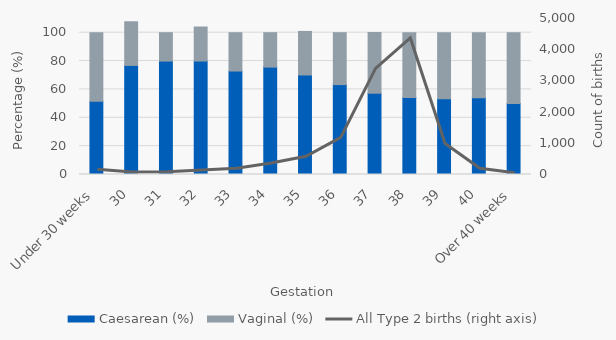
| Category | Caesarean (%) | Vaginal (%) |
|---|---|---|
| Under 30 weeks | 51.613 | 48.387 |
| 30 | 76.923 | 30.769 |
| 31 | 80 | 20 |
| 32 | 80 | 24 |
| 33 | 72.973 | 27.027 |
| 34 | 75.714 | 24.286 |
| 35 | 70.175 | 30.702 |
| 36 | 63.404 | 36.596 |
| 37 | 57.312 | 42.836 |
| 38 | 54.358 | 45.528 |
| 39 | 53.333 | 46.667 |
| 40 | 54.054 | 45.946 |
| Over 40 weeks | 50 | 50 |